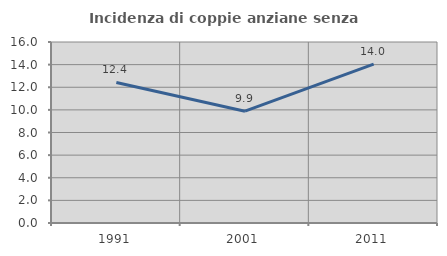
| Category | Incidenza di coppie anziane senza figli  |
|---|---|
| 1991.0 | 12.422 |
| 2001.0 | 9.884 |
| 2011.0 | 14.045 |